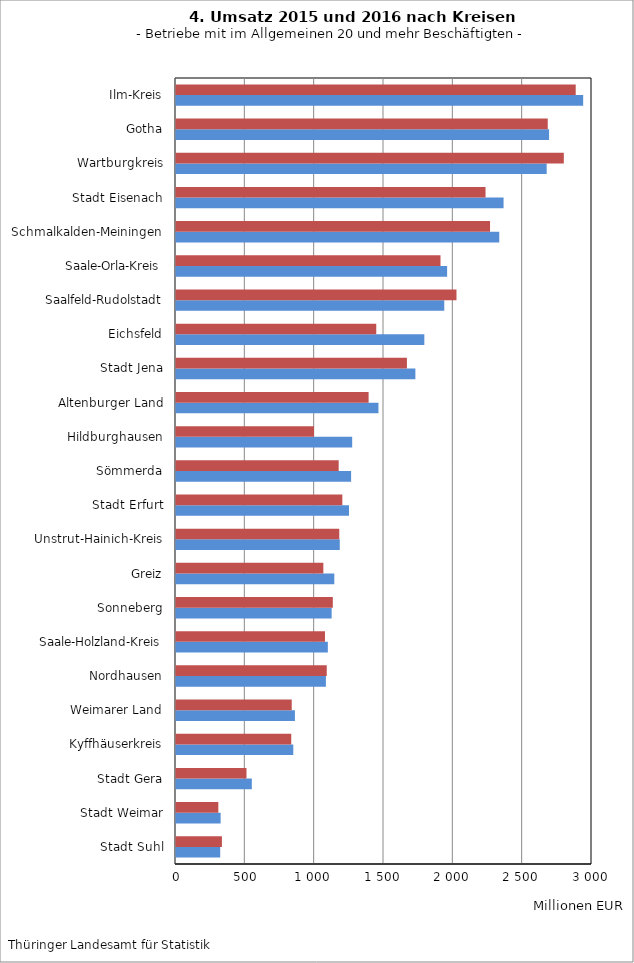
| Category | 2016 | 2015 |
|---|---|---|
| Stadt Suhl | 318.85 | 331.173 |
| Stadt Weimar | 321.87 | 305.259 |
| Stadt Gera | 546.748 | 508.334 |
| Kyffhäuserkreis | 845.803 | 831.202 |
| Weimarer Land | 857.61 | 834.591 |
| Nordhausen | 1080.979 | 1087.033 |
| Saale-Holzland-Kreis | 1094.975 | 1074.394 |
| Sonneberg | 1122.41 | 1130.902 |
| Greiz | 1141.64 | 1062.576 |
| Unstrut-Hainich-Kreis | 1181.084 | 1177.448 |
| Stadt Erfurt | 1247.532 | 1199.459 |
| Sömmerda | 1262.778 | 1173.248 |
| Hildburghausen | 1270.586 | 995.189 |
| Altenburger Land | 1459.972 | 1389.048 |
| Stadt Jena | 1726.359 | 1665.286 |
| Eichsfeld | 1790.82 | 1444.16 |
| Saalfeld-Rudolstadt | 1934.615 | 2022.75 |
| Saale-Orla-Kreis | 1955.195 | 1907.538 |
| Schmalkalden-Meiningen | 2331.278 | 2264.786 |
| Stadt Eisenach | 2362.242 | 2232.129 |
| Wartburgkreis | 2673.091 | 2796.805 |
| Gotha | 2690.489 | 2680.909 |
| Ilm-Kreis | 2936.315 | 2882.507 |